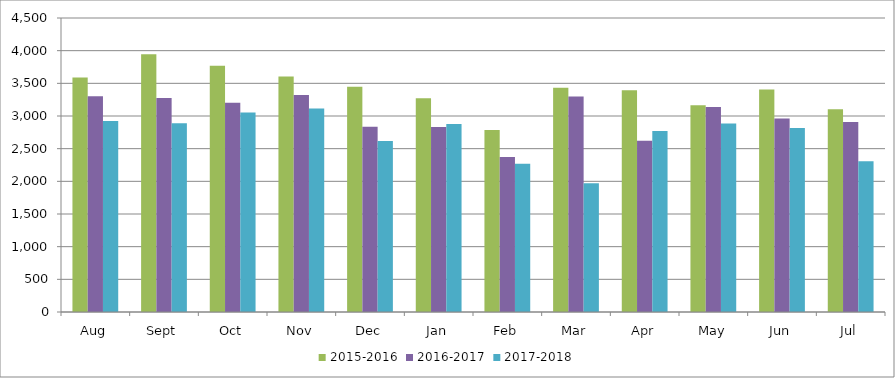
| Category | 2015-2016 | 2016-2017 | 2017-2018 |
|---|---|---|---|
| Aug | 3590 | 3304 | 2924 |
| Sept | 3947 | 3277 | 2888 |
| Oct | 3769 | 3203 | 3055 |
| Nov | 3603 | 3320 | 3115 |
| Dec | 3447 | 2836 | 2616 |
| Jan | 3271 | 2833 | 2877 |
| Feb | 2786 | 2374 | 2271 |
| Mar | 3433 | 3297 | 1972 |
| Apr | 3395 | 2622 | 2772 |
| May | 3163 | 3139 | 2887 |
| Jun | 3405 | 2962 | 2818 |
| Jul | 3103 | 2907 | 2308 |